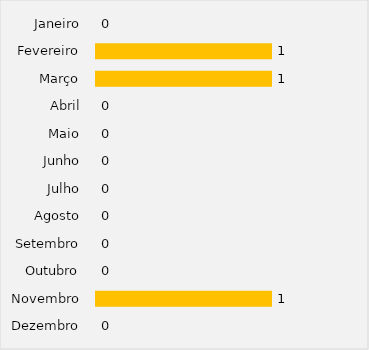
| Category | Valor |
|---|---|
| Janeiro | 0 |
| Fevereiro | 1 |
| Março | 1 |
| Abril | 0 |
| Maio | 0 |
| Junho | 0 |
| Julho | 0 |
| Agosto | 0 |
| Setembro | 0 |
| Outubro | 0 |
| Novembro | 1 |
| Dezembro | 0 |